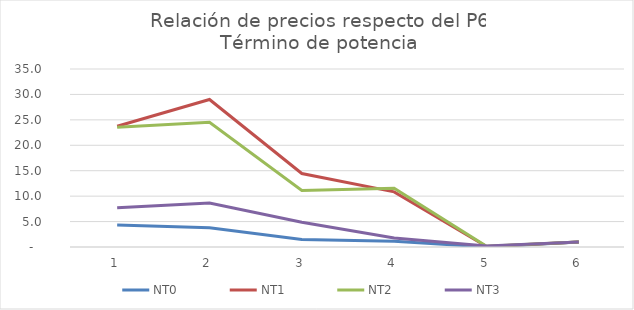
| Category | NT0 | NT1 | NT2 | NT3 |
|---|---|---|---|---|
| 0 | 4.303 | 23.745 | 23.547 | 7.703 |
| 1 | 3.782 | 29.009 | 24.513 | 8.666 |
| 2 | 1.497 | 14.451 | 11.099 | 4.849 |
| 3 | 1.13 | 10.847 | 11.555 | 1.774 |
| 4 | 0.009 | 0.113 | 0.136 | 0.195 |
| 5 | 1 | 1 | 1 | 1 |